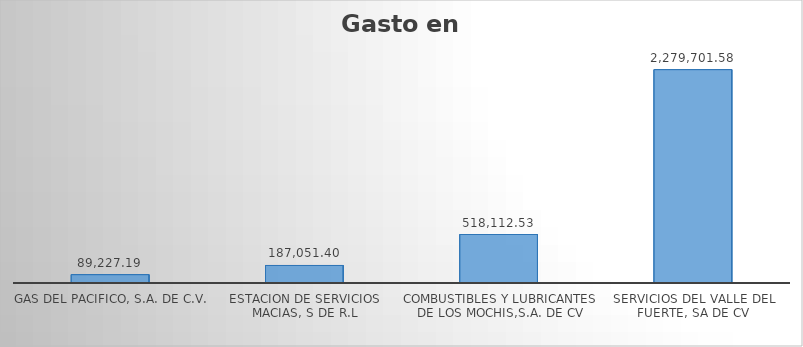
| Category | Suma |
|---|---|
| GAS DEL PACIFICO, S.A. DE C.V. | 89227.19 |
| ESTACION DE SERVICIOS MACIAS, S DE R.L | 187051.4 |
| COMBUSTIBLES Y LUBRICANTES DE LOS MOCHIS,S.A. DE CV | 518112.53 |
| SERVICIOS DEL VALLE DEL FUERTE, SA DE CV | 2279701.58 |